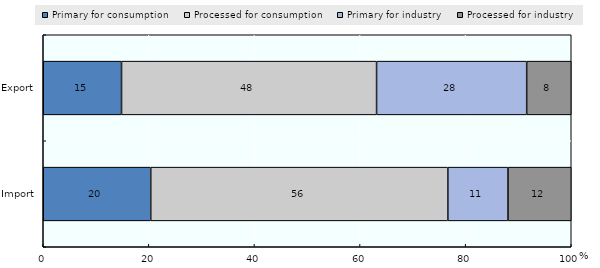
| Category | Primary for consumption | Processed for consumption | Primary for industry | Processed for industry |
|---|---|---|---|---|
| Import | 20.361 | 56.268 | 11.387 | 11.984 |
| Export | 14.827 | 48.302 | 28.429 | 8.442 |